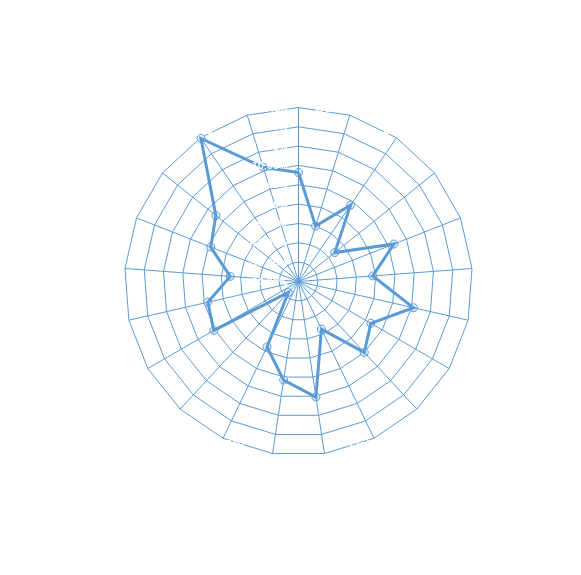
| Category | Series 0 |
|---|---|
| Oct-2021, 8.18% | 0.082 |
| Oct-2020, -5.00% | -0.05 |
| Oct-2019, 3.90% | 0.039 |
| Oct-2018, -8.00% | -0.08 |
| Oct-2017, 6.51% | 0.065 |
| Oct-2016, -.75% | -0.008 |
| Oct-2015, 10.51% | 0.105 |
| Oct-2014, 1.60% | 0.016 |
| Oct-2013, 5.02% | 0.05 |
| Oct-2012, -6.33% | -0.063 |
| Oct-2011, 10.21% | 0.102 |
| Oct-2010, 5.78% | 0.058 |
| Oct-2009, -1.25% | -0.012 |
| Oct-2008, -16.12% | -0.161 |
| Oct-2007, 5.30% | 0.053 |
| Oct-2006, 4.05% | 0.04 |
| Oct-2005, -2.30% | -0.023 |
| Oct-2004, 4.39% | 0.044 |
| Oct-2003, 7.33% | 0.073 |
| Oct-2002, 24.77% | 0.248 |
| Oct-2001, 10.91% | 0.109 |